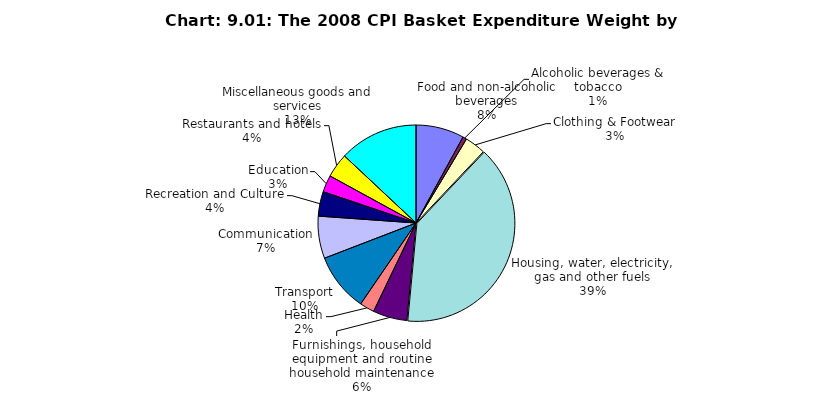
| Category | Divisions |
|---|---|
| Food and non-alcoholic beverages | 79.612 |
| Alcoholic beverages & tobacco | 6.501 |
| Clothing & Footwear | 34.304 |
| Housing, water, electricity, gas and other fuels | 394.407 |
| Furnishings, household equipment and routine household maintenance | 56.385 |
| Health | 24.244 |
| Transport | 96.081 |
| Communication | 69.708 |
| Recreation and Culture | 40.504 |
| Education | 27.912 |
| Restaurants and hotels | 40.181 |
| Miscellaneous goods and services | 130.161 |